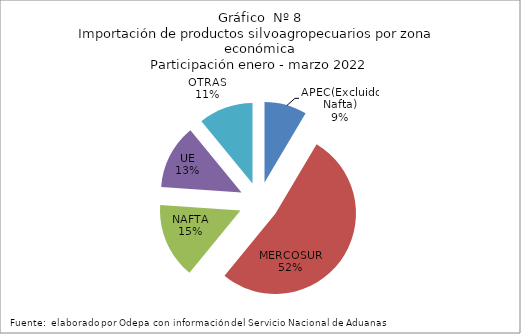
| Category | Series 0 |
|---|---|
| APEC(Excluido Nafta) | 196388.554 |
| MERCOSUR | 1206450.233 |
| NAFTA | 349237.617 |
| UE | 298587.004 |
| OTRAS | 252013.593 |